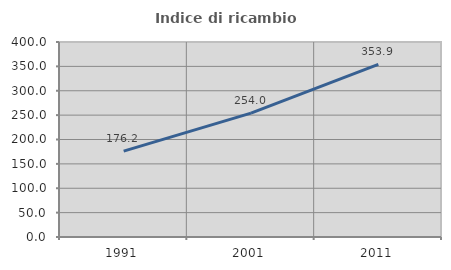
| Category | Indice di ricambio occupazionale  |
|---|---|
| 1991.0 | 176.232 |
| 2001.0 | 253.988 |
| 2011.0 | 353.933 |